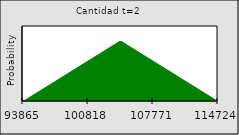
| Category | Series 0 |
|---|---|
| 93865.3416194782 | 0 |
| nan | 0 |
| nan | 0.001 |
| nan | 0.001 |
| nan | 0.002 |
| nan | 0.002 |
| nan | 0.002 |
| nan | 0.003 |
| nan | 0.003 |
| nan | 0.004 |
| nan | 0.004 |
| nan | 0.004 |
| nan | 0.005 |
| nan | 0.005 |
| nan | 0.006 |
| nan | 0.006 |
| nan | 0.007 |
| nan | 0.007 |
| nan | 0.007 |
| nan | 0.008 |
| nan | 0.008 |
| nan | 0.009 |
| nan | 0.009 |
| nan | 0.009 |
| nan | 0.01 |
| nan | 0.01 |
| nan | 0.011 |
| nan | 0.011 |
| nan | 0.011 |
| nan | 0.012 |
| nan | 0.012 |
| nan | 0.013 |
| nan | 0.013 |
| 100818.3298875878 | 0.013 |
| nan | 0.014 |
| nan | 0.014 |
| nan | 0.015 |
| nan | 0.015 |
| nan | 0.016 |
| nan | 0.016 |
| nan | 0.016 |
| nan | 0.017 |
| nan | 0.017 |
| nan | 0.018 |
| nan | 0.018 |
| nan | 0.018 |
| nan | 0.019 |
| nan | 0.019 |
| nan | 0.02 |
| nan | 0.02 |
| nan | 0.02 |
| nan | 0.02 |
| nan | 0.019 |
| nan | 0.019 |
| nan | 0.018 |
| nan | 0.018 |
| nan | 0.018 |
| nan | 0.017 |
| nan | 0.017 |
| nan | 0.016 |
| nan | 0.016 |
| nan | 0.016 |
| nan | 0.015 |
| nan | 0.015 |
| nan | 0.014 |
| nan | 0.014 |
| 107771.3181556974 | 0.013 |
| nan | 0.013 |
| nan | 0.013 |
| nan | 0.012 |
| nan | 0.012 |
| nan | 0.011 |
| nan | 0.011 |
| nan | 0.011 |
| nan | 0.01 |
| nan | 0.01 |
| nan | 0.009 |
| nan | 0.009 |
| nan | 0.009 |
| nan | 0.008 |
| nan | 0.008 |
| nan | 0.007 |
| nan | 0.007 |
| nan | 0.007 |
| nan | 0.006 |
| nan | 0.006 |
| nan | 0.005 |
| nan | 0.005 |
| nan | 0.004 |
| nan | 0.004 |
| nan | 0.004 |
| nan | 0.003 |
| nan | 0.003 |
| nan | 0.002 |
| nan | 0.002 |
| nan | 0.002 |
| nan | 0.001 |
| nan | 0.001 |
| nan | 0 |
| 114724.306423807 | 0 |